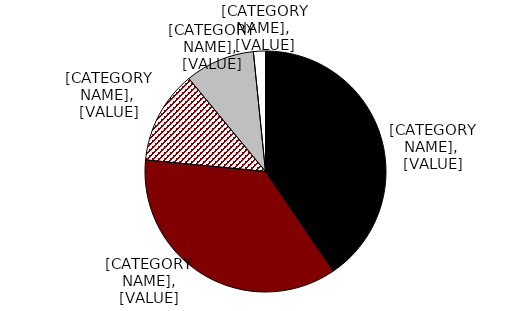
| Category | Series 0 |
|---|---|
| Spouse | 0.402 |
| Daughter | 0.358 |
| Son | 0.124 |
| Other relative | 0.093 |
| Non-relative | 0.016 |